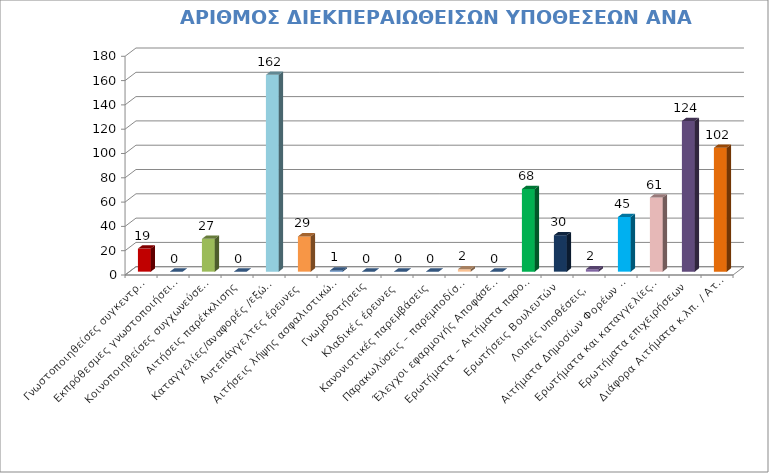
| Category | Series 0 |
|---|---|
| Γνωστοποιηθείσες συγκεντρώσεις | 19 |
| Εκπρόθεσμες γνωστοποιήσεις/πρόωρες συγκεντρώσεις | 0 |
| Κοινοποιηθείσες συγχωνεύσεις επιχειρήσεων | 27 |
| Αιτήσεις παρέκκλισης | 0 |
| Καταγγελίες/αναφορές /εξώδικα /διαμαρτυρίες | 162 |
| Αυτεπάγγελτες έρευνες  | 29 |
| Αιτήσεις λήψης ασφαλιστικών μέτρων | 1 |
| Γνωμοδοτήσεις | 0 |
| Κλαδικές έρευνες | 0 |
| Κανονιστικές παρεμβάσεις | 0 |
| Παρακωλύσεις – παρεμποδίσεις ερευνών | 2 |
| Έλεγχοι εφαρμογής Αποφάσεων της Ε.Α. | 0 |
| Ερωτήματα – Αιτήματα παροχής στοιχείων  | 68 |
| Ερωτήσεις Βουλευτών | 30 |
| Λοιπές υποθέσεις,  | 2 |
| Αιτήματα Δημοσίων Φορέων επί θεμάτων ανταγωνισμού | 45 |
| Ερωτήματα και καταγγελίες πολιτών από ιστοσελίδα Ε.Α. | 61 |
| Ερωτήματα επιχειρήσεων | 124 |
| Διάφορα Αιτήματα κ.λπ. / Αταξινόμητα | 102 |